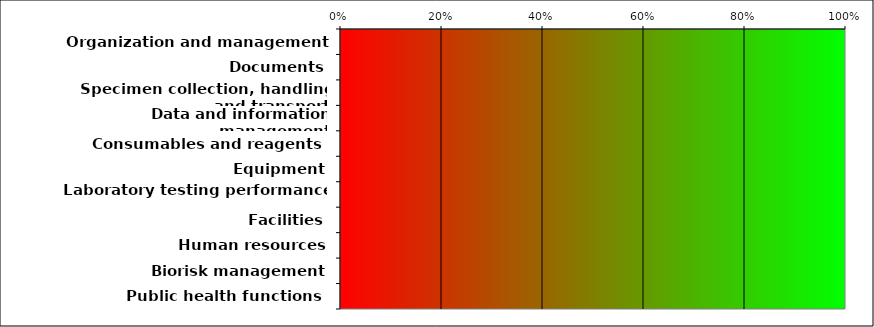
| Category | Series 7 |
|---|---|
| Organization and management | 0 |
| Documents | 0 |
| Specimen collection, handling and transport | 0 |
| Data and information management | 0 |
| Consumables and reagents  | 0 |
| Equipment | 0 |
| Laboratory testing performance | 0 |
| Facilities | 0 |
| Human resources | 0 |
| Biorisk management | 0 |
| Public health functions  | 0 |